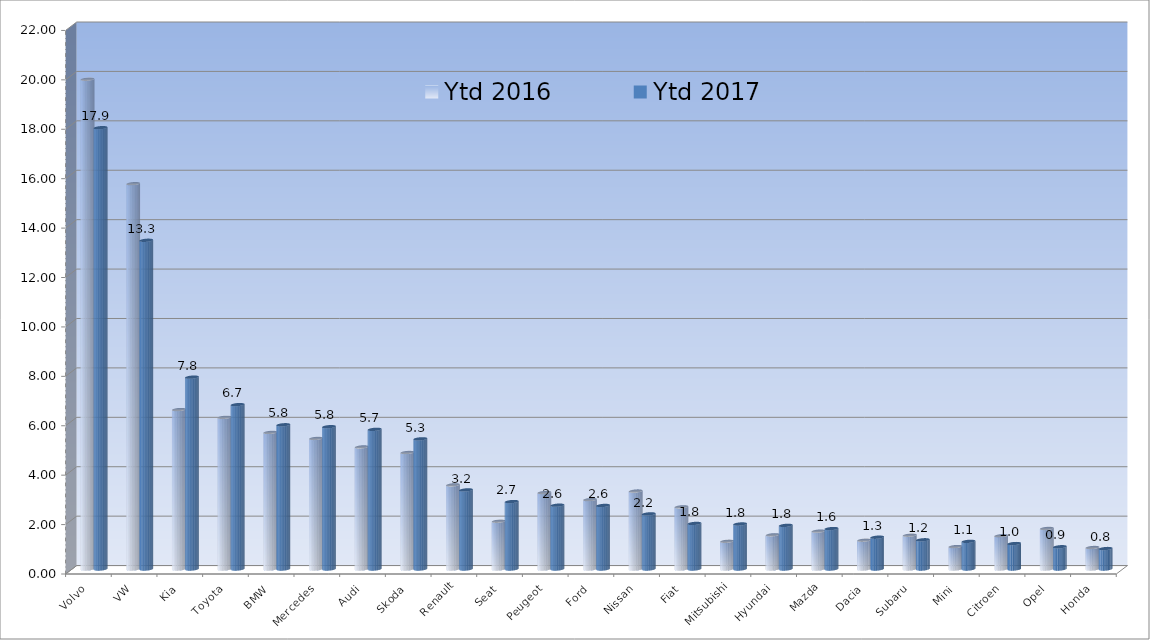
| Category | Ytd 2016 | Ytd 2017 |
|---|---|---|
| Volvo | 19.823 | 17.862 |
| VW | 15.595 | 13.304 |
| Kia | 6.453 | 7.764 |
| Toyota | 6.138 | 6.653 |
| BMW | 5.528 | 5.837 |
| Mercedes | 5.284 | 5.76 |
| Audi | 4.94 | 5.652 |
| Skoda | 4.716 | 5.268 |
| Renault | 3.404 | 3.201 |
| Seat | 1.934 | 2.729 |
| Peugeot | 3.094 | 2.583 |
| Ford | 2.808 | 2.572 |
| Nissan | 3.155 | 2.231 |
| Fiat | 2.515 | 1.844 |
| Mitsubishi | 1.122 | 1.822 |
| Hyundai | 1.384 | 1.766 |
| Mazda | 1.532 | 1.636 |
| Dacia | 1.165 | 1.287 |
| Subaru | 1.368 | 1.182 |
| Mini | 0.908 | 1.119 |
| Citroen | 1.346 | 1.03 |
| Opel | 1.641 | 0.9 |
| Honda | 0.87 | 0.827 |